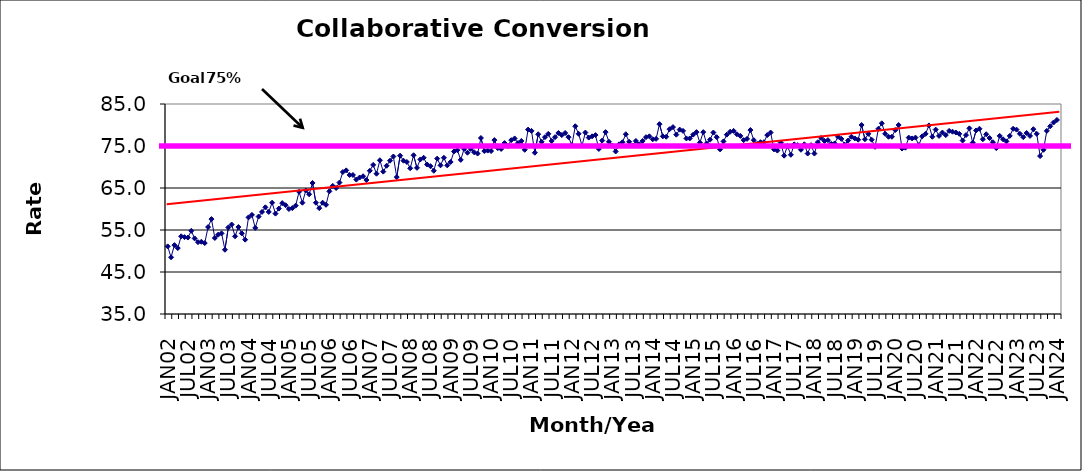
| Category | Series 0 |
|---|---|
| JAN02 | 51.1 |
| FEB02 | 48.5 |
| MAR02 | 51.4 |
| APR02 | 50.7 |
| MAY02 | 53.5 |
| JUN02 | 53.3 |
| JUL02 | 53.2 |
| AUG02 | 54.8 |
| SEP02 | 53 |
| OCT02 | 52.1 |
| NOV02 | 52.2 |
| DEC02 | 51.9 |
| JAN03 | 55.7 |
| FEB03 | 57.6 |
| MAR03 | 53.1 |
| APR03 | 53.9 |
| MAY03 | 54.2 |
| JUN03 | 50.3 |
| JUL03 | 55.6 |
| AUG03 | 56.3 |
| SEP03 | 53.5 |
| OCT03 | 55.7 |
| NOV03 | 54.2 |
| DEC03 | 52.7 |
| JAN04 | 58 |
| FEB04 | 58.6 |
| MAR04 | 55.5 |
| APR04 | 58.2 |
| MAY04 | 59.3 |
| JUN04 | 60.4 |
| JUL04 | 59.3 |
| AUG04 | 61.5 |
| SEP04 | 58.9 |
| OCT04 | 60.1 |
| NOV04 | 61.4 |
| DEC04 | 60.9 |
| JAN05 | 60 |
| FEB05 | 60.2 |
| MAR05 | 60.8 |
| APR05 | 64.1 |
| MAY05 | 61.5 |
| JUN05 | 64.4 |
| JUL05 | 63.5 |
| AUG05 | 66.2 |
| SEP05 | 61.5 |
| OCT05 | 60.2 |
| NOV05 | 61.5 |
| DEC05 | 61 |
| JAN06 | 64.2 |
| FEB06 | 65.5 |
| MAR06 | 65 |
| APR06 | 66.3 |
| MAY06 | 68.8 |
| JUN06 | 69.2 |
| JUL06 | 68.1 |
| AUG06 | 68.1 |
| SEP06 | 67 |
| OCT06 | 67.5 |
| NOV06 | 67.8 |
| DEC06 | 66.9 |
| JAN07 | 69.1 |
| FEB07 | 70.5 |
| MAR07 | 68.4 |
| APR07 | 71.6 |
| MAY07 | 68.9 |
| JUN07 | 70.3 |
| JUL07 | 71.5 |
| AUG07 | 72.5 |
| SEP07 | 67.6 |
| OCT07 | 72.7 |
| NOV07 | 71.5 |
| DEC07 | 71.2 |
| JAN08 | 69.7 |
| FEB08 | 72.8 |
| MAR08 | 69.8 |
| APR08 | 71.8 |
| MAY08 | 72.2 |
| JUN08 | 70.6 |
| JUL08 | 70.2 |
| AUG08 | 69.1 |
| SEP08 | 72 |
| OCT08 | 70.4 |
| NOV08 | 72.2 |
| DEC08 | 70.4 |
| JAN09 | 71.2 |
| FEB09 | 73.7 |
| MAR09 | 74 |
| APR09 | 71.7 |
| MAY09 | 74.3 |
| JUN09 | 73.4 |
| JUL09 | 74.3 |
| AUG09 | 73.5 |
| SEP09 | 73.2 |
| OCT09 | 76.9 |
| NOV09 | 73.8 |
| DEC09 | 73.9 |
| JAN10 | 73.8 |
| FEB10 | 76.4 |
| MAR10 | 74.5 |
| APR10 | 74.3 |
| MAY10 | 75.7 |
| JUN10 | 75 |
| JUL10 | 76.4 |
| AUG10 | 76.8 |
| SEP10 | 75.7 |
| OCT10 | 76.2 |
| NOV10 | 74.1 |
| DEC10 | 78.9 |
| JAN11 | 78.6 |
| FEB11 | 73.4 |
| MAR11 | 77.8 |
| APR11 | 76 |
| MAY11 | 77.1 |
| JUN11 | 77.9 |
| JUL11 | 76.2 |
| AUG11 | 77.1 |
| SEP11 | 78.1 |
| OCT11 | 77.6 |
| NOV11 | 78.1 |
| DEC11 | 77.1 |
| JAN12 | 75.2 |
| FEB12 | 79.7 |
| MAR12 | 77.9 |
| APR12 | 75.1 |
| MAY12 | 78.2 |
| JUN12 | 77 |
| JUL12 | 77.3 |
| AUG12 | 77.6 |
| SEP12 | 74.3 |
| OCT12 | 76.3 |
| NOV12 | 78.3 |
| DEC12 | 76 |
| JAN13 | 75.1 |
| FEB13 | 73.7 |
| MAR13 | 75.4 |
| APR13 | 75.9 |
| MAY13 | 77.8 |
| JUN13 | 76 |
| JUL13 | 75.1 |
| AUG13 | 76.2 |
| SEP13 | 75.4 |
| OCT13 | 76.2 |
| NOV13 | 77.1 |
| DEC13 | 77.3 |
| JAN14 | 76.6 |
| FEB14 | 76.7 |
| MAR14 | 80.2 |
| APR14 | 77.3 |
| MAY14 | 77.2 |
| JUN14 | 79 |
| JUL14 | 79.5 |
| AUG14 | 77.7 |
| SEP14 | 78.9 |
| OCT14 | 78.6 |
| NOV14 | 76.8 |
| DEC14 | 76.8 |
| JAN15 | 77.7 |
| FEB15 | 78.3 |
| MAR15 | 75.8 |
| APR15 | 78.3 |
| MAY15 | 75.6 |
| JUN15 | 76.5 |
| JUL15 | 78.2 |
| AUG15 | 77.1 |
| SEP15 | 74.2 |
| OCT15 | 76.1 |
| NOV15 | 77.7 |
| DEC15 | 78.4 |
| JAN16 | 78.6 |
| FEB16 | 77.8 |
| MAR16 | 77.4 |
| APR16 | 76.4 |
| MAY16 | 76.7 |
| JUN16 | 78.8 |
| JUL16 | 76.4 |
| AUG16 | 75.5 |
| SEP16 | 75.9 |
| OCT16 | 75.9 |
| NOV16 | 77.6 |
| DEC16 | 78.2 |
| JAN17 | 74.2 |
| FEB17 | 73.9 |
| MAR17 | 75.8 |
| APR17 | 72.7 |
| MAY17 | 75 |
| JUN17 | 72.9 |
| JUL17 | 75.4 |
| AUG17 | 75.2 |
| SEP17 | 74.1 |
| OCT17 | 75.4 |
| NOV17 | 73.2 |
| DEC17 | 75.2 |
| JAN18 | 73.2 |
| FEB18 | 75.9 |
| MAR18 | 76.9 |
| APR18 | 76.2 |
| MAY18 | 76.4 |
| JUN18 | 75.5 |
| JUL18 | 75.6 |
| AUG18 | 77.2 |
| SEP18 | 76.7 |
| OCT18 | 75.3 |
| NOV18 | 76.3 |
| DEC18 | 77.2 |
| JAN19 | 76.8 |
| FEB19 | 76.5 |
| MAR19 | 80 |
| APR19 | 76.6 |
| MAY19 | 77.9 |
| JUN19 | 76.5 |
| JUL19 | 74.8 |
| AUG19 | 79.1 |
| SEP19 | 80.4 |
| OCT19 | 77.9 |
| NOV19 | 77.2 |
| DEC19 | 77.2 |
| JAN20 | 78.8 |
| FEB20 | 80 |
| MAR20 | 74.4 |
| APR20 | 74.6 |
| MAY20 | 77 |
| JUN20 | 76.8 |
| JUL20 | 77 |
| AUG20 | 75.2 |
| SEP20 | 77.3 |
| OCT20 | 77.9 |
| NOV20 | 79.9 |
| DEC20 | 77.2 |
| JAN21 | 78.9 |
| FEB21 | 77.4 |
| MAR21 | 78.2 |
| APR21 | 77.6 |
| MAY21 | 78.6 |
| JUN21 | 78.4 |
| JUL21 | 78.2 |
| AUG21 | 77.9 |
| SEP21 | 76.3 |
| OCT21 | 77.6 |
| NOV21 | 79.2 |
| DEC21 | 75.8 |
| JAN22 | 78.7 |
| FEB22 | 79.1 |
| MAR22 | 76.6 |
| APR22 | 77.8 |
| MAY22 | 76.9 |
| JUN22 | 75.9 |
| JUL22 | 74.5 |
| AUG22 | 77.4 |
| SEP22 | 76.6 |
| OCT22 | 76.1 |
| NOV22 | 77.4 |
| DEC22 | 79.1 |
| JAN23 | 78.9 |
| FEB23 | 77.9 |
| MAR23 | 77.1 |
| APR23 | 78.1 |
| MAY23 | 77.4 |
| JUN23 | 79 |
| JUL23 | 77.9 |
| AUG23 | 72.6 |
| SEP23 | 74.1 |
| OCT23 | 78.6 |
| NOV23 | 79.7 |
| DEC23 | 80.6 |
| JAN24 | 81.2 |